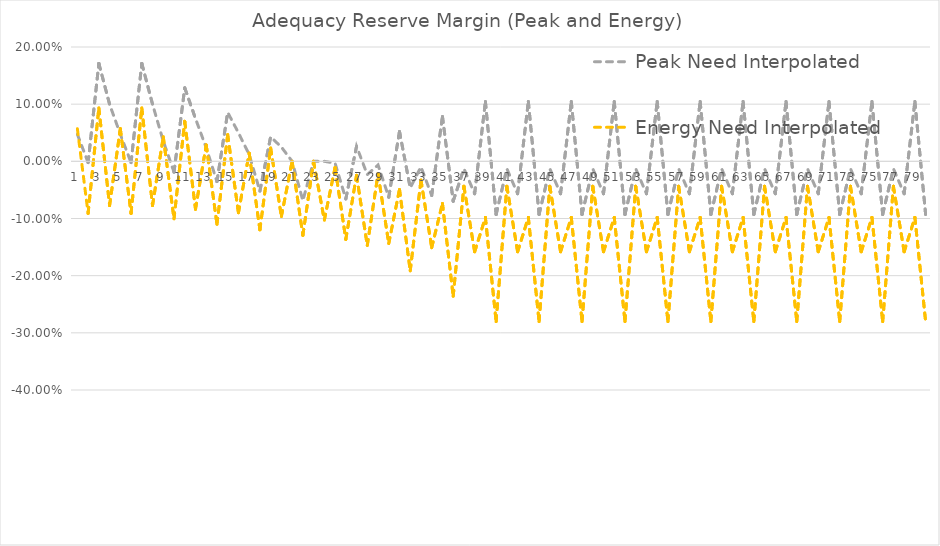
| Category | Peak Need Interpolated | Energy Need Interpolated |
|---|---|---|
| 0 | 0.047 | 0.057 |
| 1 | -0.002 | -0.091 |
| 2 | 0.171 | 0.093 |
| 3 | 0.1 | -0.077 |
| 4 | 0.047 | 0.057 |
| 5 | -0.002 | -0.091 |
| 6 | 0.171 | 0.093 |
| 7 | 0.1 | -0.077 |
| 8 | 0.035 | 0.043 |
| 9 | -0.019 | -0.101 |
| 10 | 0.128 | 0.07 |
| 11 | 0.075 | -0.084 |
| 12 | 0.024 | 0.029 |
| 13 | -0.035 | -0.11 |
| 14 | 0.086 | 0.047 |
| 15 | 0.05 | -0.09 |
| 16 | 0.012 | 0.014 |
| 17 | -0.052 | -0.12 |
| 18 | 0.043 | 0.023 |
| 19 | 0.025 | -0.096 |
| 20 | 0 | 0 |
| 21 | -0.069 | -0.129 |
| 22 | 0 | 0 |
| 23 | 0 | -0.103 |
| 24 | -0.003 | -0.011 |
| 25 | -0.066 | -0.137 |
| 26 | 0.026 | -0.025 |
| 27 | -0.023 | -0.147 |
| 28 | -0.006 | -0.022 |
| 29 | -0.063 | -0.144 |
| 30 | 0.052 | -0.049 |
| 31 | -0.046 | -0.192 |
| 32 | -0.01 | -0.033 |
| 33 | -0.06 | -0.151 |
| 34 | 0.079 | -0.074 |
| 35 | -0.07 | -0.236 |
| 36 | -0.013 | -0.044 |
| 37 | -0.057 | -0.158 |
| 38 | 0.105 | -0.098 |
| 39 | -0.093 | -0.28 |
| 40 | -0.013 | -0.044 |
| 41 | -0.057 | -0.158 |
| 42 | 0.105 | -0.098 |
| 43 | -0.093 | -0.28 |
| 44 | -0.013 | -0.044 |
| 45 | -0.057 | -0.158 |
| 46 | 0.105 | -0.098 |
| 47 | -0.093 | -0.28 |
| 48 | -0.013 | -0.044 |
| 49 | -0.057 | -0.158 |
| 50 | 0.105 | -0.098 |
| 51 | -0.093 | -0.28 |
| 52 | -0.013 | -0.044 |
| 53 | -0.057 | -0.158 |
| 54 | 0.105 | -0.098 |
| 55 | -0.093 | -0.28 |
| 56 | -0.013 | -0.044 |
| 57 | -0.057 | -0.158 |
| 58 | 0.105 | -0.098 |
| 59 | -0.093 | -0.28 |
| 60 | -0.013 | -0.044 |
| 61 | -0.057 | -0.158 |
| 62 | 0.105 | -0.098 |
| 63 | -0.093 | -0.28 |
| 64 | -0.013 | -0.044 |
| 65 | -0.057 | -0.158 |
| 66 | 0.105 | -0.098 |
| 67 | -0.093 | -0.28 |
| 68 | -0.013 | -0.044 |
| 69 | -0.057 | -0.158 |
| 70 | 0.105 | -0.098 |
| 71 | -0.093 | -0.28 |
| 72 | -0.013 | -0.044 |
| 73 | -0.057 | -0.158 |
| 74 | 0.105 | -0.098 |
| 75 | -0.093 | -0.28 |
| 76 | -0.013 | -0.044 |
| 77 | -0.057 | -0.158 |
| 78 | 0.105 | -0.098 |
| 79 | -0.093 | -0.28 |